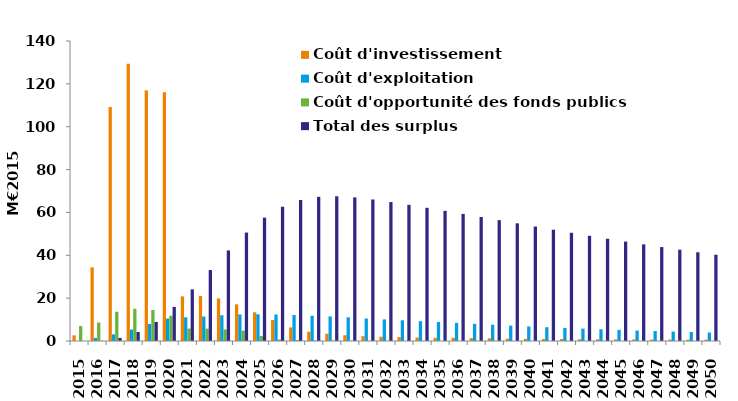
| Category | Coût d'investissement | Coût d'exploitation | Coût d'opportunité des fonds publics | Total des surplus |
|---|---|---|---|---|
| 2015.0 | 2.671 | 0 | 6.955 | 0 |
| 2016.0 | 34.397 | 1.427 | 8.633 | 0.061 |
| 2017.0 | 109.193 | 3.109 | 13.667 | 1.434 |
| 2018.0 | 129.331 | 5.343 | 15.036 | 4.205 |
| 2019.0 | 116.977 | 7.961 | 14.49 | 8.91 |
| 2020.0 | 116.125 | 10.469 | 11.757 | 15.925 |
| 2021.0 | 20.815 | 11.066 | 5.794 | 24.092 |
| 2022.0 | 21.024 | 11.415 | 5.745 | 33.121 |
| 2023.0 | 19.85 | 12.003 | 5.43 | 42.27 |
| 2024.0 | 17.113 | 12.385 | 4.812 | 50.606 |
| 2025.0 | 13.402 | 12.468 | 2.342 | 57.568 |
| 2026.0 | 9.76 | 12.367 | 0.674 | 62.69 |
| 2027.0 | 6.354 | 12.152 | 0.398 | 65.821 |
| 2028.0 | 4.325 | 11.793 | 0.237 | 67.276 |
| 2029.0 | 3.379 | 11.469 | 0.164 | 67.544 |
| 2030.0 | 2.695 | 11.062 | 0.114 | 67.013 |
| 2031.0 | 2.259 | 10.481 | 0.083 | 66.041 |
| 2032.0 | 1.988 | 10.079 | 0.066 | 64.847 |
| 2033.0 | 1.839 | 9.669 | 0.059 | 63.54 |
| 2034.0 | 1.625 | 9.255 | 0.046 | 62.156 |
| 2035.0 | 1.507 | 8.846 | 0.041 | 60.749 |
| 2036.0 | 1.498 | 8.431 | 0.031 | 59.314 |
| 2037.0 | 1.368 | 8.007 | 0.025 | 57.861 |
| 2038.0 | 1.246 | 7.592 | 0.02 | 56.4 |
| 2039.0 | 1.087 | 7.182 | 0.011 | 54.913 |
| 2040.0 | 1.001 | 6.795 | 0.008 | 53.426 |
| 2041.0 | 0.949 | 6.446 | 0.008 | 51.955 |
| 2042.0 | 0.899 | 6.104 | 0.007 | 50.506 |
| 2043.0 | 0.852 | 5.78 | 0.007 | 49.094 |
| 2044.0 | 0.807 | 5.474 | 0.007 | 47.722 |
| 2045.0 | 0.764 | 5.184 | 0.006 | 46.387 |
| 2046.0 | 0.724 | 4.912 | 0.006 | 45.09 |
| 2047.0 | 0.686 | 4.654 | 0.006 | 43.83 |
| 2048.0 | 0.65 | 4.409 | 0.005 | 42.604 |
| 2049.0 | 0.616 | 4.178 | 0.005 | 41.413 |
| 2050.0 | 0.584 | 3.958 | 0.005 | 40.255 |